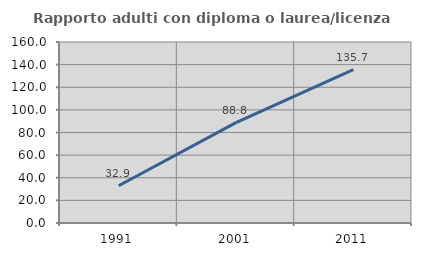
| Category | Rapporto adulti con diploma o laurea/licenza media  |
|---|---|
| 1991.0 | 32.905 |
| 2001.0 | 88.756 |
| 2011.0 | 135.682 |